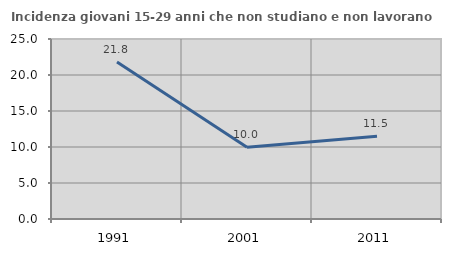
| Category | Incidenza giovani 15-29 anni che non studiano e non lavorano  |
|---|---|
| 1991.0 | 21.818 |
| 2001.0 | 9.967 |
| 2011.0 | 11.504 |